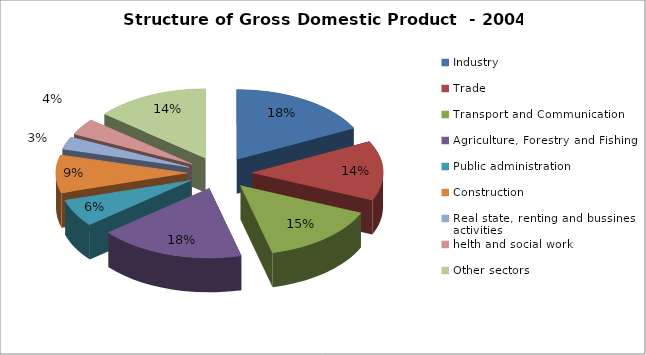
| Category | 2004 |
|---|---|
| Industry | 1.582 |
| Trade | 1.247 |
| Transport and Communication | 1.313 |
| Agriculture, Forestry and Fishing | 1.611 |
| Public administration | 0.574 |
| Construction | 0.793 |
| Real state, renting and bussines activities | 0.262 |
| helth and social work | 0.346 |
| Other sectors | 1.261 |